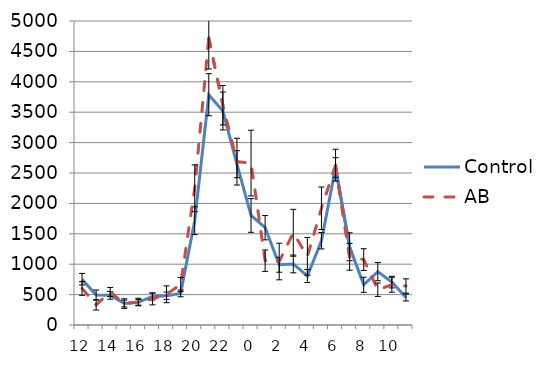
| Category | Control | AB |
|---|---|---|
| 12.0 | 752.9 | 600.956 |
| 13.0 | 493.3 | 330.839 |
| 14.0 | 488.061 | 542.55 |
| 15.0 | 353.239 | 352.161 |
| 16.0 | 372.625 | 377.639 |
| 17.0 | 469.843 | 427.817 |
| 18.0 | 480.743 | 504.678 |
| 19.0 | 520.075 | 666.2 |
| 20.0 | 1715.382 | 2248.967 |
| 21.0 | 3787.293 | 4719.817 |
| 22.0 | 3519.825 | 3614.294 |
| 23.0 | 2644.957 | 2687.05 |
| 0.0 | 1801.568 | 2662.661 |
| 1.0 | 1600.179 | 1058.05 |
| 2.0 | 990.893 | 1044.122 |
| 3.0 | 1004.579 | 1516.578 |
| 4.0 | 805.789 | 1129.894 |
| 5.0 | 1386.204 | 1919.511 |
| 6.0 | 2590.786 | 2628.889 |
| 7.0 | 1286.989 | 1122.006 |
| 8.0 | 661.557 | 1075.172 |
| 9.0 | 877.368 | 580.172 |
| 10.0 | 705.607 | 662.433 |
| 11.0 | 453.232 | 641.383 |